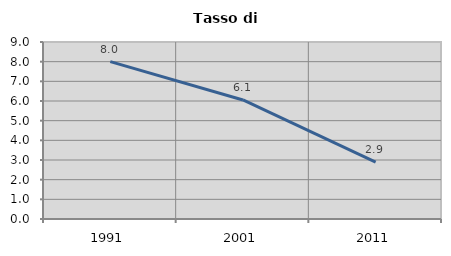
| Category | Tasso di disoccupazione   |
|---|---|
| 1991.0 | 8 |
| 2001.0 | 6.053 |
| 2011.0 | 2.887 |